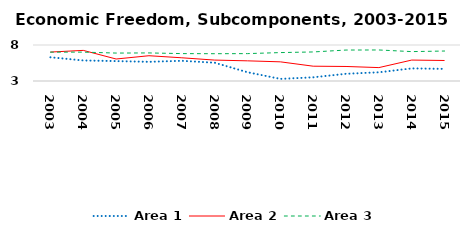
| Category | Area 1 | Area 2 | Area 3 |
|---|---|---|---|
| 2003.0 | 6.297 | 7.018 | 7.009 |
| 2004.0 | 5.853 | 7.251 | 7.01 |
| 2005.0 | 5.765 | 6.055 | 6.88 |
| 2006.0 | 5.666 | 6.509 | 6.899 |
| 2007.0 | 5.805 | 6.225 | 6.805 |
| 2008.0 | 5.539 | 5.905 | 6.79 |
| 2009.0 | 4.218 | 5.801 | 6.804 |
| 2010.0 | 3.293 | 5.661 | 6.946 |
| 2011.0 | 3.51 | 5.056 | 7.034 |
| 2012.0 | 4.001 | 5.017 | 7.3 |
| 2013.0 | 4.21 | 4.86 | 7.309 |
| 2014.0 | 4.751 | 5.908 | 7.083 |
| 2015.0 | 4.684 | 5.849 | 7.163 |